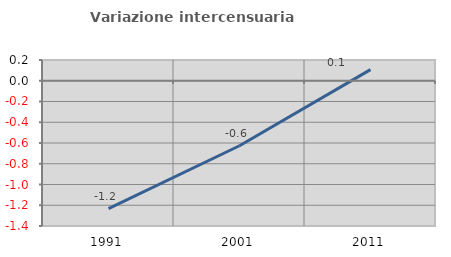
| Category | Variazione intercensuaria annua |
|---|---|
| 1991.0 | -1.232 |
| 2001.0 | -0.627 |
| 2011.0 | 0.108 |